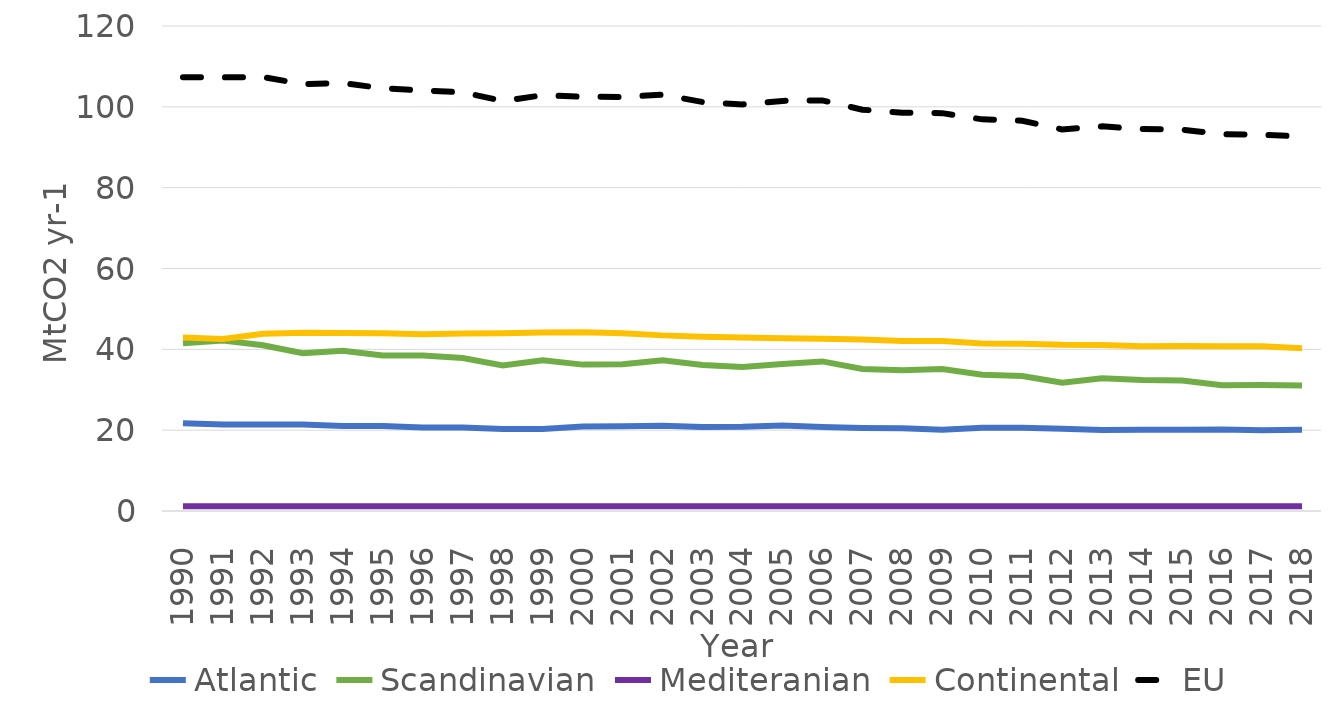
| Category | Atlantic | Scandinavian | Mediteranian | Continental | EU |
|---|---|---|---|---|---|
| 1990 | 21.704 | 41.524 | 1.162 | 42.934 | 107.324 |
| 1991 | 21.385 | 42.157 | 1.162 | 42.587 | 107.29 |
| 1992 | 21.378 | 41.003 | 1.157 | 43.835 | 107.372 |
| 1993 | 21.379 | 39.028 | 1.153 | 44.08 | 105.641 |
| 1994 | 21.042 | 39.666 | 1.15 | 44.012 | 105.871 |
| 1995 | 21.007 | 38.477 | 1.153 | 43.957 | 104.595 |
| 1996 | 20.663 | 38.486 | 1.15 | 43.76 | 104.059 |
| 1997 | 20.648 | 37.865 | 1.151 | 43.935 | 103.599 |
| 1998 | 20.28 | 36.031 | 1.152 | 43.985 | 101.448 |
| 1999 | 20.295 | 37.273 | 1.151 | 44.16 | 102.88 |
| 2000 | 20.897 | 36.22 | 1.151 | 44.219 | 102.487 |
| 2001 | 20.983 | 36.301 | 1.153 | 44.009 | 102.446 |
| 2002 | 21.076 | 37.307 | 1.158 | 43.454 | 102.994 |
| 2003 | 20.796 | 36.127 | 1.16 | 43.118 | 101.201 |
| 2004 | 20.862 | 35.623 | 1.161 | 42.949 | 100.595 |
| 2005 | 21.151 | 36.393 | 1.166 | 42.754 | 101.464 |
| 2006 | 20.812 | 37.008 | 1.172 | 42.604 | 101.596 |
| 2007 | 20.554 | 35.14 | 1.17 | 42.436 | 99.3 |
| 2008 | 20.453 | 34.852 | 1.168 | 42.067 | 98.539 |
| 2009 | 20.106 | 35.137 | 1.158 | 42.038 | 98.439 |
| 2010 | 20.576 | 33.699 | 1.161 | 41.463 | 96.899 |
| 2011 | 20.597 | 33.41 | 1.17 | 41.39 | 96.567 |
| 2012 | 20.376 | 31.744 | 1.159 | 41.127 | 94.406 |
| 2013 | 20.046 | 32.866 | 1.168 | 41.099 | 95.179 |
| 2014 | 20.13 | 32.414 | 1.168 | 40.786 | 94.499 |
| 2015 | 20.083 | 32.289 | 1.167 | 40.828 | 94.367 |
| 2016 | 20.166 | 31.114 | 1.182 | 40.783 | 93.246 |
| 2017 | 20.006 | 31.155 | 1.169 | 40.737 | 93.068 |
| 2018 | 20.122 | 31.071 | 1.169 | 40.294 | 92.656 |